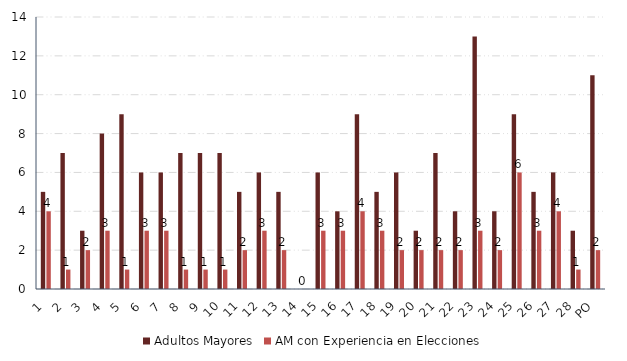
| Category | Adultos Mayores | AM con Experiencia en Elecciones |
|---|---|---|
| 1 | 5 | 4 |
| 2 | 7 | 1 |
| 3 | 3 | 2 |
| 4 | 8 | 3 |
| 5 | 9 | 1 |
| 6 | 6 | 3 |
| 7 | 6 | 3 |
| 8 | 7 | 1 |
| 9 | 7 | 1 |
| 10 | 7 | 1 |
| 11 | 5 | 2 |
| 12 | 6 | 3 |
| 13 | 5 | 2 |
| 14 | 0 | 0 |
| 15 | 6 | 3 |
| 16 | 4 | 3 |
| 17 | 9 | 4 |
| 18 | 5 | 3 |
| 19 | 6 | 2 |
| 20 | 3 | 2 |
| 21 | 7 | 2 |
| 22 | 4 | 2 |
| 23 | 13 | 3 |
| 24 | 4 | 2 |
| 25 | 9 | 6 |
| 26 | 5 | 3 |
| 27 | 6 | 4 |
| 28 | 3 | 1 |
| PO | 11 | 2 |